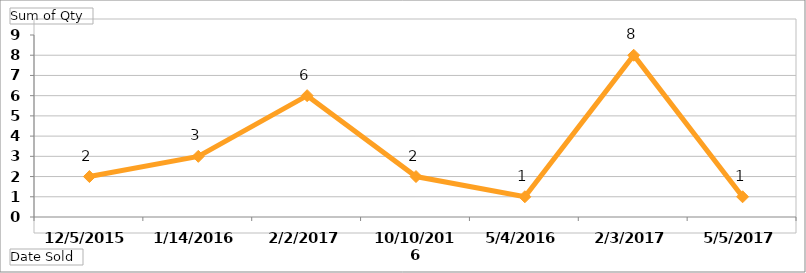
| Category | Total |
|---|---|
| 12/5/2015 | 2 |
| 1/14/2016 | 3 |
| 2/2/2017 | 6 |
| 10/10/2016 | 2 |
| 5/4/2016 | 1 |
| 2/3/2017 | 8 |
| 5/5/2017 | 1 |